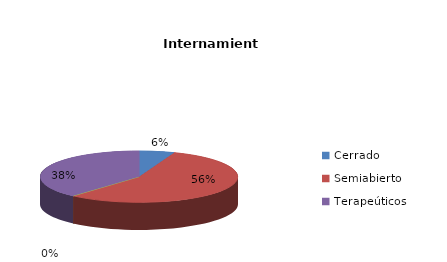
| Category | Series 0 |
|---|---|
| Cerrado | 3 |
| Semiabierto | 29 |
| Abierto | 0 |
| Terapeúticos | 20 |